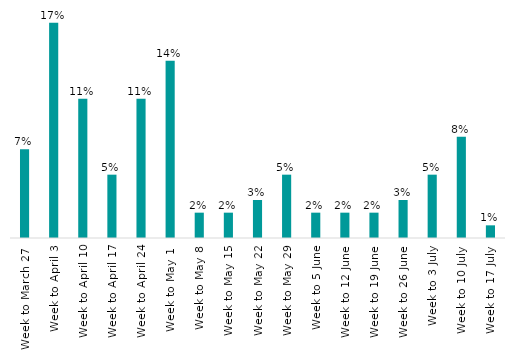
| Category | Series 0 |
|---|---|
| Week to March 27  | 0.07 |
| Week to April 3 | 0.17 |
| Week to April 10 | 0.11 |
| Week to April 17 | 0.05 |
| Week to April 24 | 0.11 |
| Week to May 1  | 0.14 |
| Week to May 8 | 0.02 |
| Week to May 15 | 0.02 |
| Week to May 22 | 0.03 |
| Week to May 29 | 0.05 |
| Week to 5 June | 0.02 |
| Week to 12 June | 0.02 |
| Week to 19 June | 0.02 |
| Week to 26 June | 0.03 |
| Week to 3 July | 0.05 |
| Week to 10 July | 0.08 |
| Week to 17 July | 0.01 |